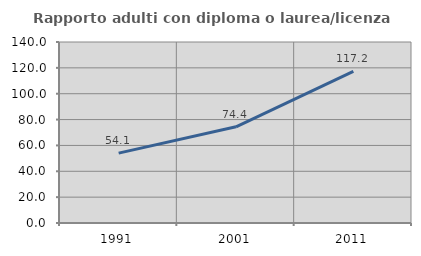
| Category | Rapporto adulti con diploma o laurea/licenza media  |
|---|---|
| 1991.0 | 54.07 |
| 2001.0 | 74.384 |
| 2011.0 | 117.241 |